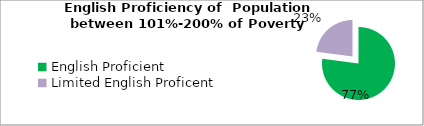
| Category | Percent |
|---|---|
| English Proficient | 0.771 |
| Limited English Proficent | 0.229 |